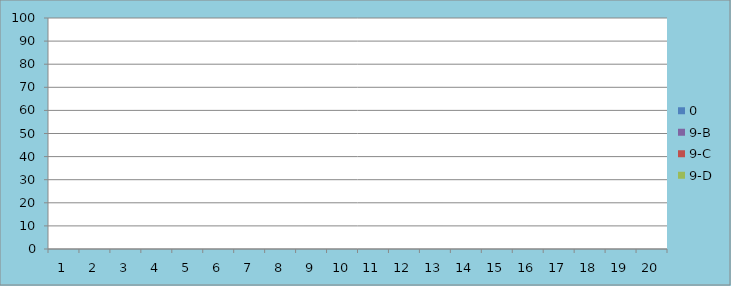
| Category | 0 | 9-B | 9-C | 9-D |
|---|---|---|---|---|
| 1.0 | 0 | 0 | 0 | 0 |
| 2.0 | 0 | 0 | 0 | 0 |
| 3.0 | 0 | 0 | 0 | 0 |
| 4.0 | 0 | 0 | 0 | 0 |
| 5.0 | 0 | 0 | 0 | 0 |
| 6.0 | 0 | 0 | 0 | 0 |
| 7.0 | 0 | 0 | 0 | 0 |
| 8.0 | 0 | 0 | 0 | 0 |
| 9.0 | 0 | 0 | 0 | 0 |
| 10.0 | 0 | 0 | 0 | 0 |
| 11.0 | 0 | 0 | 0 | 0 |
| 12.0 | 0 | 0 | 0 | 0 |
| 13.0 | 0 | 0 | 0 | 0 |
| 14.0 | 0 | 0 | 0 | 0 |
| 15.0 | 0 | 0 | 0 | 0 |
| 16.0 | 0 | 0 | 0 | 0 |
| 17.0 | 0 | 0 | 0 | 0 |
| 18.0 | 0 | 0 | 0 | 0 |
| 19.0 | 0 | 0 | 0 | 0 |
| 20.0 | 0 | 0 | 0 | 0 |